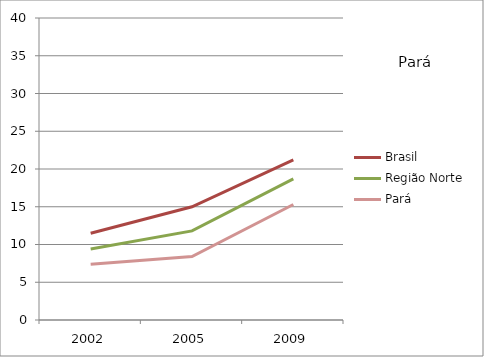
| Category | Brasil | Região Norte | Pará |
|---|---|---|---|
| 2002.0 | 11.5 | 9.4 | 7.4 |
| 2005.0 | 15 | 11.8 | 8.4 |
| 2009.0 | 21.2 | 18.7 | 15.3 |